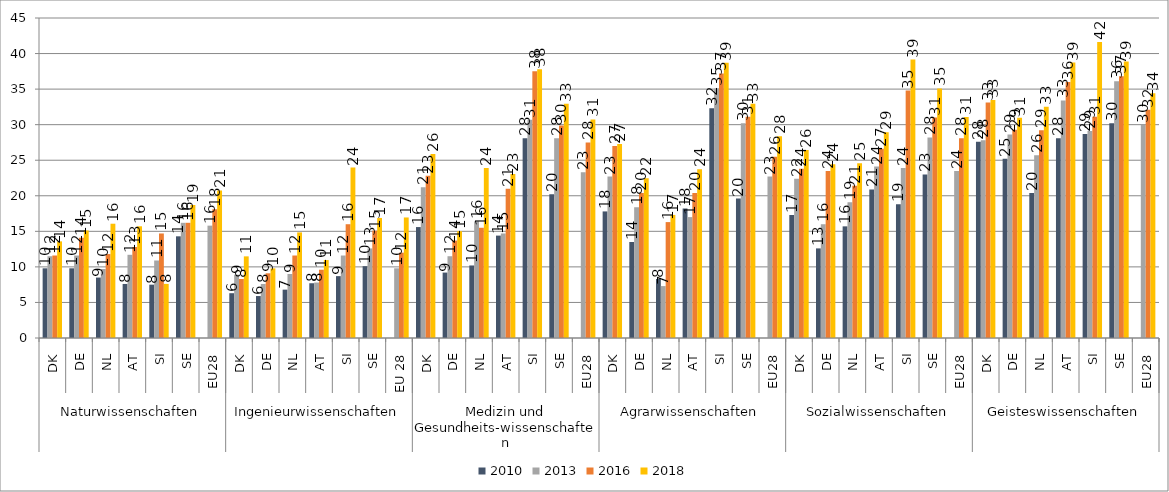
| Category | 2010 | 2013 | 2016 | 2018 |
|---|---|---|---|---|
| 0 | 9.8 | 11.5 | 11.6 | 13.59 |
| 1 | 9.8 | 11.6 | 14.1 | 15.13 |
| 2 | 8.5 | 9.7 | 11.8 | 16.07 |
| 3 | 7.6 | 11.7 | 12.8 | 15.71 |
| 4 | 7.5 | 10.9 | 14.7 | 7.61 |
| 5 | 14.3 | 16.2 | 16.2 | 18.69 |
| 6 | 0 | 15.8 | 18.1 | 20.75 |
| 7 | 6.3 | 8.9 | 8.3 | 11.48 |
| 8 | 5.9 | 7.6 | 9.1 | 9.79 |
| 9 | 6.8 | 9 | 11.6 | 14.85 |
| 10 | 7.7 | 7.8 | 9.6 | 10.96 |
| 11 | 8.7 | 11.6 | 16 | 23.96 |
| 12 | 10.1 | 12.6 | 15.1 | 16.88 |
| 13 | 0 | 9.8 | 12 | 16.95 |
| 14 | 15.6 | 21.2 | 22.8 | 25.86 |
| 15 | 9.2 | 11.5 | 13.7 | 15.02 |
| 16 | 10.2 | 16.4 | 15.5 | 23.9 |
| 17 | 14.4 | 14.7 | 21 | 23.05 |
| 18 | 28.1 | 30.7 | 37.5 | 37.8 |
| 19 | 20.2 | 28.1 | 29.9 | 32.94 |
| 20 | 0 | 23.3 | 27.5 | 30.74 |
| 21 | 17.8 | 22.7 | 27 | 27.27 |
| 22 | 13.5 | 18.4 | 20.4 | 22.46 |
| 23 | 8.3 | 7.3 | 16.3 | 17.31 |
| 24 | 18.2 | 17 | 20.4 | 23.73 |
| 25 | 32.3 | 35.1 | 37.2 | 38.71 |
| 26 | 19.6 | 30.2 | 31.1 | 32.94 |
| 27 | 0 | 22.7 | 25.5 | 28.37 |
| 28 | 17.3 | 22.4 | 23.8 | 26.42 |
| 29 | 12.6 | 16 | 23.5 | 24.44 |
| 30 | 15.7 | 19.1 | 21.4 | 24.58 |
| 31 | 20.9 | 24.1 | 26.6 | 28.92 |
| 32 | 18.8 | 23.9 | 34.8 | 39.15 |
| 33 | 23 | 28.2 | 31 | 35.1 |
| 34 | 0 | 23.5 | 28.1 | 31.08 |
| 35 | 27.6 | 27.8 | 33.1 | 33.48 |
| 36 | 25.2 | 28.6 | 29.3 | 30.97 |
| 37 | 20.4 | 25.7 | 29.2 | 32.53 |
| 38 | 28.1 | 33.4 | 36 | 38.73 |
| 39 | 28.7 | 29.1 | 31.1 | 41.62 |
| 40 | 30.2 | 36.1 | 36.8 | 38.87 |
| 41 | 0 | 30 | 32.1 | 34.41 |